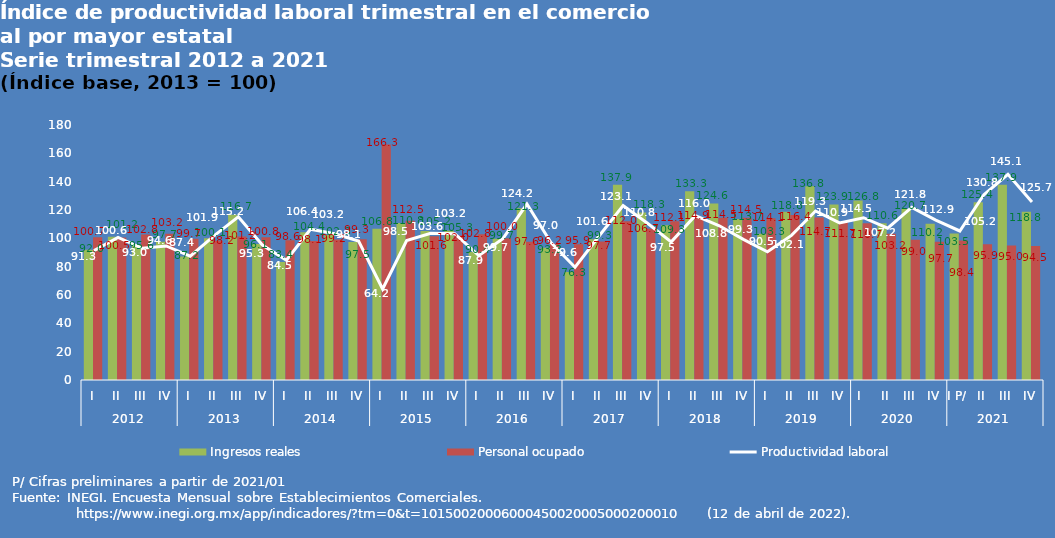
| Category | Ingresos reales | Personal ocupado |
|---|---|---|
| 0 | 91.986 | 100.723 |
| 1 | 101.173 | 100.549 |
| 2 | 95.587 | 102.781 |
| 3 | 97.654 | 103.211 |
| 4 | 87.159 | 99.686 |
| 5 | 100.098 | 98.233 |
| 6 | 116.672 | 101.236 |
| 7 | 96.071 | 100.844 |
| 8 | 83.376 | 98.639 |
| 9 | 104.369 | 98.084 |
| 10 | 102.343 | 99.186 |
| 11 | 97.453 | 99.33 |
| 12 | 106.798 | 166.301 |
| 13 | 110.755 | 112.452 |
| 14 | 105.165 | 101.554 |
| 15 | 105.268 | 101.96 |
| 16 | 90.369 | 102.836 |
| 17 | 99.726 | 99.993 |
| 18 | 121.25 | 97.621 |
| 19 | 93.339 | 96.191 |
| 20 | 76.323 | 95.897 |
| 21 | 99.274 | 97.679 |
| 22 | 137.87 | 111.99 |
| 23 | 118.312 | 106.735 |
| 24 | 109.292 | 112.092 |
| 25 | 133.32 | 114.912 |
| 26 | 124.61 | 114.48 |
| 27 | 113.693 | 114.507 |
| 28 | 103.264 | 114.143 |
| 29 | 118.811 | 116.396 |
| 30 | 136.811 | 114.659 |
| 31 | 123.935 | 111.738 |
| 32 | 126.763 | 110.678 |
| 33 | 110.59 | 103.163 |
| 34 | 120.657 | 99.023 |
| 35 | 110.248 | 97.669 |
| 36 | 103.5 | 98.4 |
| 37 | 125.385 | 95.877 |
| 38 | 137.88 | 94.992 |
| 39 | 118.817 | 94.534 |